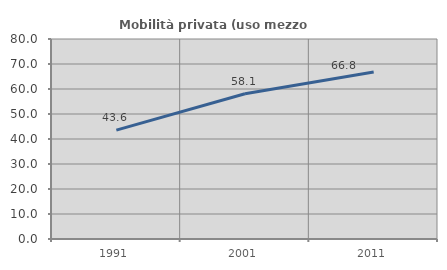
| Category | Mobilità privata (uso mezzo privato) |
|---|---|
| 1991.0 | 43.57 |
| 2001.0 | 58.124 |
| 2011.0 | 66.798 |